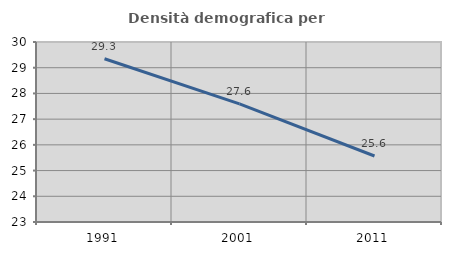
| Category | Densità demografica |
|---|---|
| 1991.0 | 29.347 |
| 2001.0 | 27.592 |
| 2011.0 | 25.566 |